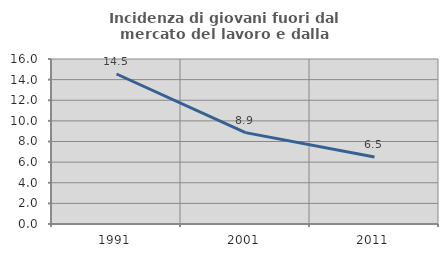
| Category | Incidenza di giovani fuori dal mercato del lavoro e dalla formazione  |
|---|---|
| 1991.0 | 14.545 |
| 2001.0 | 8.861 |
| 2011.0 | 6.494 |